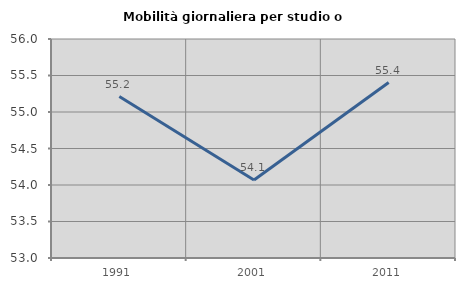
| Category | Mobilità giornaliera per studio o lavoro |
|---|---|
| 1991.0 | 55.211 |
| 2001.0 | 54.069 |
| 2011.0 | 55.403 |